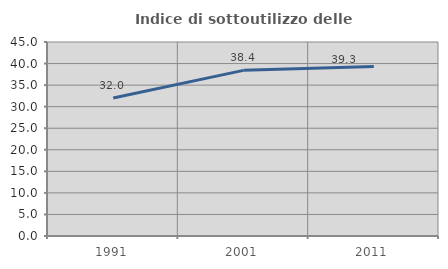
| Category | Indice di sottoutilizzo delle abitazioni  |
|---|---|
| 1991.0 | 31.99 |
| 2001.0 | 38.419 |
| 2011.0 | 39.297 |